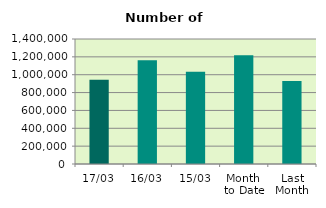
| Category | Series 0 |
|---|---|
| 17/03 | 944622 |
| 16/03 | 1161728 |
| 15/03 | 1032966 |
| Month 
to Date | 1218871.538 |
| Last
Month | 928647.7 |